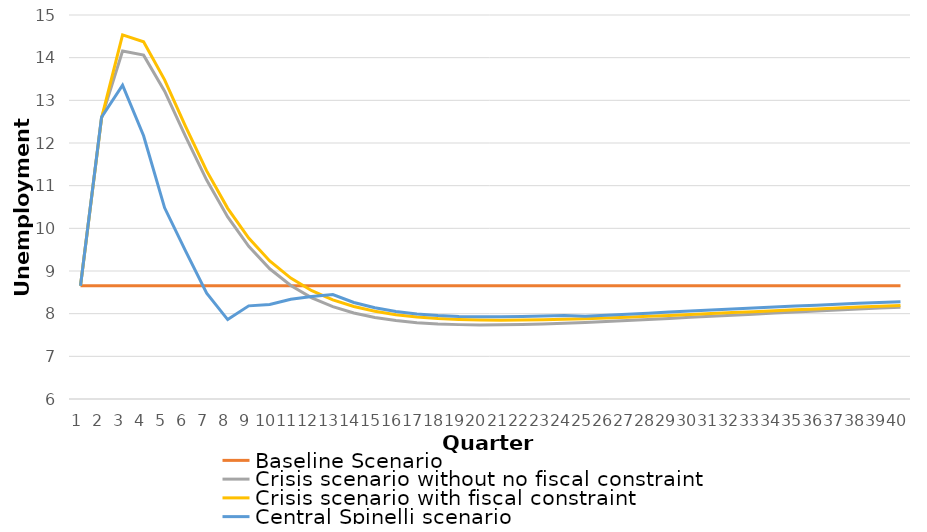
| Category | Baseline Scenario | Crisis scenario without no fiscal constraint | Crisis scenario with fiscal constraint | Central Spinelli scenario |
|---|---|---|---|---|
| 0 | 8.654 | 8.654 | 8.654 | 8.654 |
| 1 | 8.654 | 12.583 | 12.583 | 12.603 |
| 2 | 8.654 | 14.155 | 14.535 | 13.356 |
| 3 | 8.654 | 14.059 | 14.371 | 12.17 |
| 4 | 8.654 | 13.215 | 13.479 | 10.481 |
| 5 | 8.654 | 12.15 | 12.384 | 9.465 |
| 6 | 8.654 | 11.132 | 11.347 | 8.48 |
| 7 | 8.654 | 10.267 | 10.469 | 7.861 |
| 8 | 8.654 | 9.578 | 9.77 | 8.183 |
| 9 | 8.654 | 9.052 | 9.235 | 8.215 |
| 10 | 8.654 | 8.659 | 8.835 | 8.339 |
| 11 | 8.654 | 8.372 | 8.539 | 8.405 |
| 12 | 8.654 | 8.163 | 8.323 | 8.447 |
| 13 | 8.654 | 8.014 | 8.167 | 8.262 |
| 14 | 8.654 | 7.91 | 8.055 | 8.137 |
| 15 | 8.654 | 7.837 | 7.975 | 8.051 |
| 16 | 8.654 | 7.789 | 7.92 | 7.993 |
| 17 | 8.654 | 7.759 | 7.884 | 7.956 |
| 18 | 8.654 | 7.743 | 7.861 | 7.935 |
| 19 | 8.654 | 7.737 | 7.85 | 7.926 |
| 20 | 8.654 | 7.739 | 7.846 | 7.925 |
| 21 | 8.654 | 7.747 | 7.849 | 7.932 |
| 22 | 8.654 | 7.76 | 7.857 | 7.944 |
| 23 | 8.654 | 7.777 | 7.868 | 7.96 |
| 24 | 8.654 | 7.796 | 7.883 | 7.938 |
| 25 | 8.654 | 7.817 | 7.9 | 7.965 |
| 26 | 8.654 | 7.84 | 7.918 | 7.988 |
| 27 | 8.654 | 7.864 | 7.938 | 8.012 |
| 28 | 8.654 | 7.888 | 7.959 | 8.036 |
| 29 | 8.654 | 7.913 | 7.981 | 8.06 |
| 30 | 8.654 | 7.938 | 8.003 | 8.084 |
| 31 | 8.654 | 7.964 | 8.025 | 8.108 |
| 32 | 8.654 | 7.989 | 8.047 | 8.132 |
| 33 | 8.654 | 8.013 | 8.069 | 8.155 |
| 34 | 8.654 | 8.038 | 8.091 | 8.178 |
| 35 | 8.654 | 8.062 | 8.112 | 8.2 |
| 36 | 8.654 | 8.085 | 8.133 | 8.221 |
| 37 | 8.654 | 8.108 | 8.154 | 8.242 |
| 38 | 8.654 | 8.13 | 8.174 | 8.262 |
| 39 | 8.654 | 8.151 | 8.193 | 8.282 |